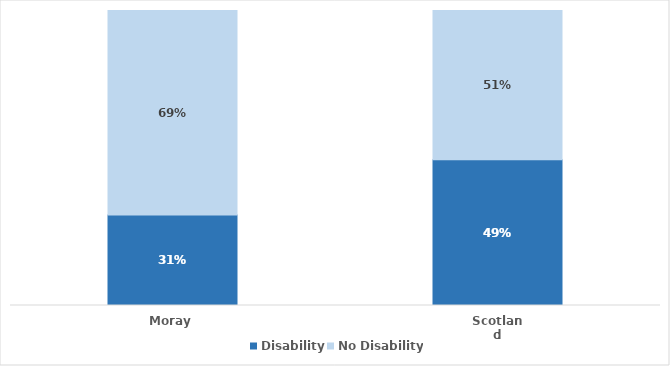
| Category | Disability | No Disability |
|---|---|---|
| Moray | 0.307 | 0.693 |
| Scotland | 0.494 | 0.506 |